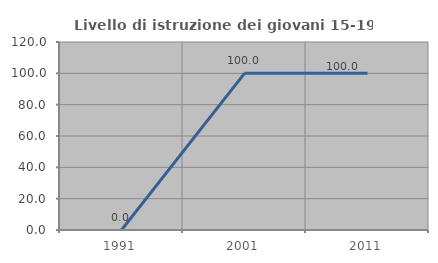
| Category | Livello di istruzione dei giovani 15-19 anni |
|---|---|
| 1991.0 | 0 |
| 2001.0 | 100 |
| 2011.0 | 100 |